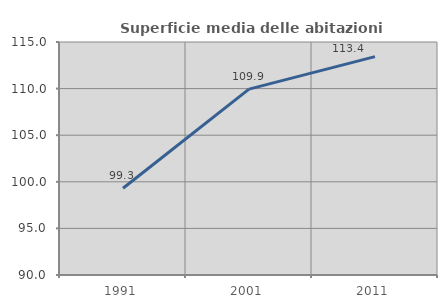
| Category | Superficie media delle abitazioni occupate |
|---|---|
| 1991.0 | 99.312 |
| 2001.0 | 109.946 |
| 2011.0 | 113.429 |